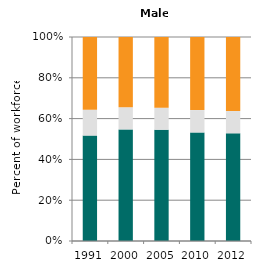
| Category | Agriculture | Industry | Services |
|---|---|---|---|
| 1991.0 | 51.681 | 12.651 | 35.668 |
| 2000.0 | 54.712 | 10.833 | 34.455 |
| 2005.0 | 54.541 | 10.822 | 34.637 |
| 2010.0 | 53.217 | 10.969 | 35.814 |
| 2012.0 | 52.778 | 10.92 | 36.301 |